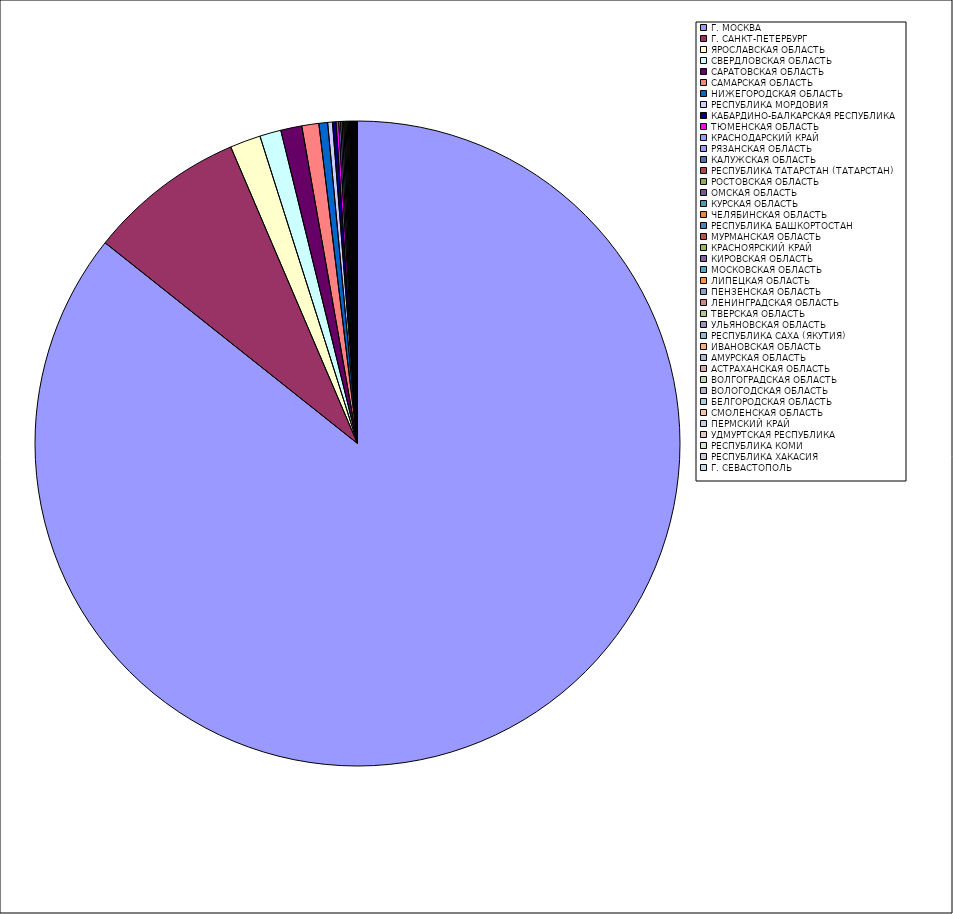
| Category | Оборот |
|---|---|
| Г. МОСКВА | 85.653 |
| Г. САНКТ-ПЕТЕРБУРГ | 7.876 |
| ЯРОСЛАВСКАЯ ОБЛАСТЬ | 1.536 |
| СВЕРДЛОВСКАЯ ОБЛАСТЬ | 1.067 |
| САРАТОВСКАЯ ОБЛАСТЬ | 1.056 |
| САМАРСКАЯ ОБЛАСТЬ | 0.851 |
| НИЖЕГОРОДСКАЯ ОБЛАСТЬ | 0.437 |
| РЕСПУБЛИКА МОРДОВИЯ | 0.24 |
| КАБАРДИНО-БАЛКАРСКАЯ РЕСПУБЛИКА | 0.173 |
| ТЮМЕНСКАЯ ОБЛАСТЬ | 0.135 |
| КРАСНОДАРСКИЙ КРАЙ | 0.088 |
| РЯЗАНСКАЯ ОБЛАСТЬ | 0.078 |
| КАЛУЖСКАЯ ОБЛАСТЬ | 0.076 |
| РЕСПУБЛИКА ТАТАРСТАН (ТАТАРСТАН) | 0.06 |
| РОСТОВСКАЯ ОБЛАСТЬ | 0.06 |
| ОМСКАЯ ОБЛАСТЬ | 0.057 |
| КУРСКАЯ ОБЛАСТЬ | 0.054 |
| ЧЕЛЯБИНСКАЯ ОБЛАСТЬ | 0.053 |
| РЕСПУБЛИКА БАШКОРТОСТАН | 0.04 |
| МУРМАНСКАЯ ОБЛАСТЬ | 0.032 |
| КРАСНОЯРСКИЙ КРАЙ | 0.032 |
| КИРОВСКАЯ ОБЛАСТЬ | 0.028 |
| МОСКОВСКАЯ ОБЛАСТЬ | 0.028 |
| ЛИПЕЦКАЯ ОБЛАСТЬ | 0.028 |
| ПЕНЗЕНСКАЯ ОБЛАСТЬ | 0.027 |
| ЛЕНИНГРАДСКАЯ ОБЛАСТЬ | 0.024 |
| ТВЕРСКАЯ ОБЛАСТЬ | 0.024 |
| УЛЬЯНОВСКАЯ ОБЛАСТЬ | 0.02 |
| РЕСПУБЛИКА САХА (ЯКУТИЯ) | 0.017 |
| ИВАНОВСКАЯ ОБЛАСТЬ | 0.014 |
| АМУРСКАЯ ОБЛАСТЬ | 0.013 |
| АСТРАХАНСКАЯ ОБЛАСТЬ | 0.012 |
| ВОЛГОГРАДСКАЯ ОБЛАСТЬ | 0.011 |
| ВОЛОГОДСКАЯ ОБЛАСТЬ | 0.009 |
| БЕЛГОРОДСКАЯ ОБЛАСТЬ | 0.009 |
| СМОЛЕНСКАЯ ОБЛАСТЬ | 0.008 |
| ПЕРМСКИЙ КРАЙ | 0.007 |
| УДМУРТСКАЯ РЕСПУБЛИКА | 0.007 |
| РЕСПУБЛИКА КОМИ | 0.006 |
| РЕСПУБЛИКА ХАКАСИЯ | 0.006 |
| Г. СЕВАСТОПОЛЬ | 0.005 |